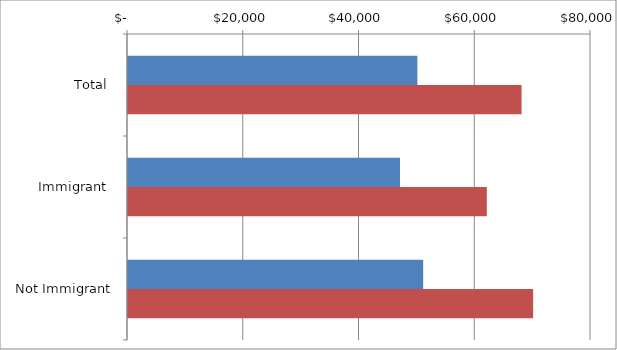
| Category | Series 0 | Series 1 |
|---|---|---|
| Total | 50000 | 68000 |
|  Immigrant  | 47000 | 62000 |
|  Not Immigrant  | 51000 | 70000 |